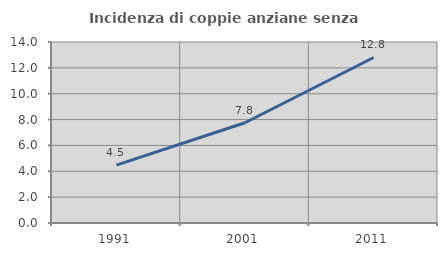
| Category | Incidenza di coppie anziane senza figli  |
|---|---|
| 1991.0 | 4.479 |
| 2001.0 | 7.755 |
| 2011.0 | 12.801 |